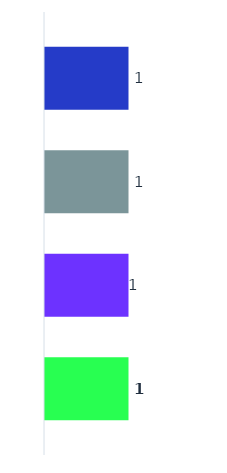
| Category | Series 2 | Series 3 | Series 0 | Series 1 |
|---|---|---|---|---|
| 0 | 1 | 1 | 1 | 1 |